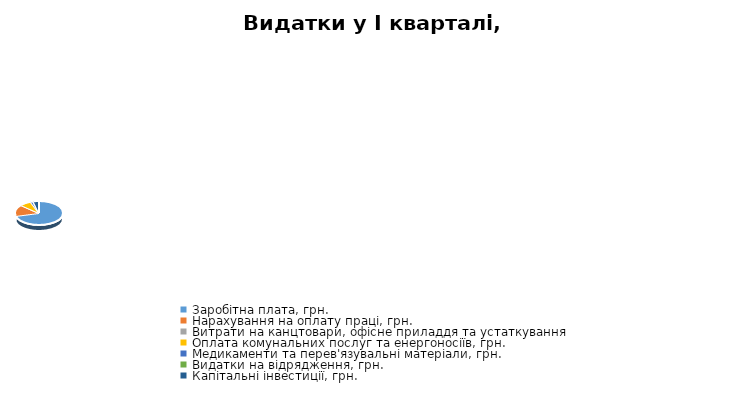
| Category | Видатки у І кварталі, грн. |
|---|---|
| Заробітна плата, грн. | 5601915 |
| Нарахування на оплату праці, грн. | 1218426.9 |
| Витрати на канцтовари, офісне приладдя та устаткування  | 0 |
| Оплата комунальних послуг та енергоносіїв, грн. | 613544.107 |
| Медикаменти та перев'язувальні матеріали, грн. | 130000 |
| Видатки на відрядження, грн. | 33300 |
| Капітальні інвестиції, грн. | 290000 |